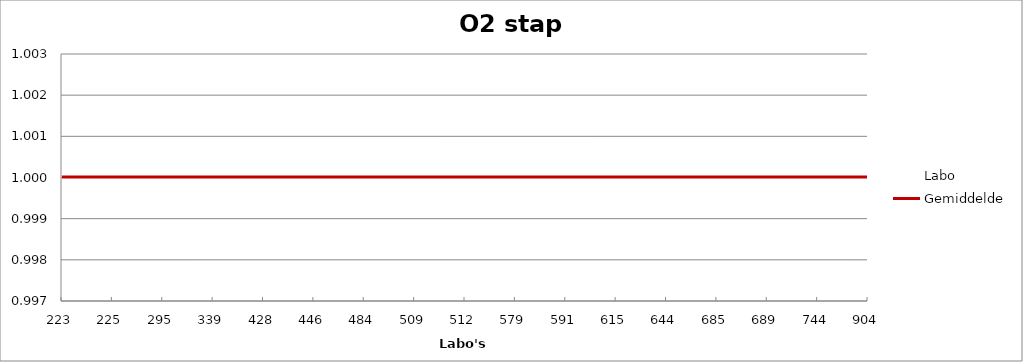
| Category | Labo | Gemiddelde |
|---|---|---|
| 223.0 | 1 | 1 |
| 225.0 | 1 | 1 |
| 295.0 | 1 | 1 |
| 339.0 | 1 | 1 |
| 428.0 | 1 | 1 |
| 446.0 | 1.003 | 1 |
| 484.0 | 1.001 | 1 |
| 509.0 | 1 | 1 |
| 512.0 | 1 | 1 |
| 579.0 | 1 | 1 |
| 591.0 | 1 | 1 |
| 615.0 | 1 | 1 |
| 644.0 | 1 | 1 |
| 685.0 | 0.999 | 1 |
| 689.0 | 1 | 1 |
| 744.0 | 1 | 1 |
| 904.0 | 0.999 | 1 |